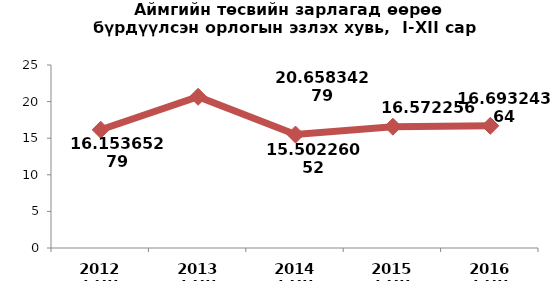
| Category | Series 0 |
|---|---|
| 2012 I-XII | 16.154 |
| 2013 I-XII | 20.658 |
| 2014 I-XII | 15.502 |
| 2015 I-XII | 16.572 |
| 2016 I-XII | 16.693 |